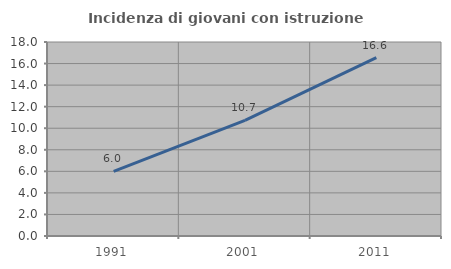
| Category | Incidenza di giovani con istruzione universitaria |
|---|---|
| 1991.0 | 5.996 |
| 2001.0 | 10.719 |
| 2011.0 | 16.554 |